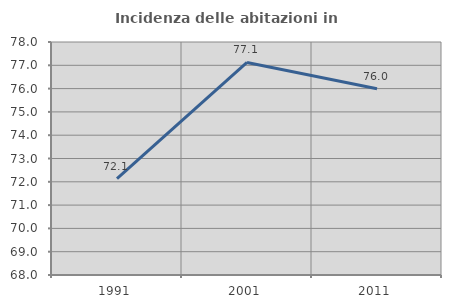
| Category | Incidenza delle abitazioni in proprietà  |
|---|---|
| 1991.0 | 72.134 |
| 2001.0 | 77.123 |
| 2011.0 | 75.993 |